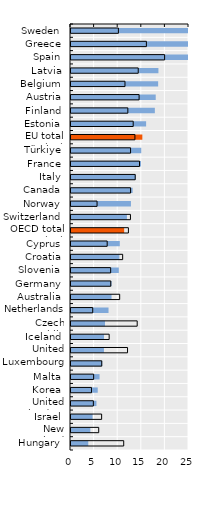
| Category | Foreign-born  | Native-born |
|---|---|---|
| Sweden | 28.126 | 10.043 |
| Greece | 25.488 | 15.97 |
| Spain | 25.192 | 19.833 |
| Latvia | 18.522 | 14.242 |
| Belgium | 18.463 | 11.437 |
| Austria | 17.95 | 14.429 |
| Finland | 17.765 | 12.041 |
| Estonia | 15.915 | 13.177 |
| EU total (23) | 15.113 | 13.543 |
| Türkiye | 14.89 | 12.619 |
| France | 14.823 | 14.516 |
| Italy | 13.75 | 13.601 |
| Canada | 13.057 | 12.621 |
| Norway | 12.7 | 5.519 |
| Switzerland | 11.85 | 12.598 |
| OECD total (29) | 11.262 | 12.165 |
| Cyprus | 10.34 | 7.666 |
| Croatia | 10.246 | 10.947 |
| Slovenia | 10.13 | 8.402 |
| Germany | 8.594 | 8.428 |
| Australia | 8.589 | 10.315 |
| Netherlands | 7.951 | 4.6 |
| Czech Republic | 7.202 | 14.023 |
| Iceland | 6.999 | 8.085 |
| United States | 6.98 | 11.98 |
| Luxembourg | 6.625 | 6.514 |
| Malta | 6.052 | 4.798 |
| Korea | 5.661 | 4.337 |
| United Kingdom | 5.392 | 4.735 |
| Israel | 4.57 | 6.49 |
| New Zealand | 4.098 | 5.872 |
| Hungary | 3.659 | 11.169 |